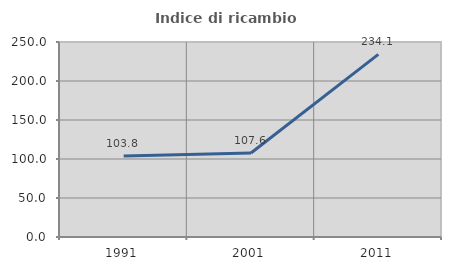
| Category | Indice di ricambio occupazionale  |
|---|---|
| 1991.0 | 103.822 |
| 2001.0 | 107.639 |
| 2011.0 | 234.091 |